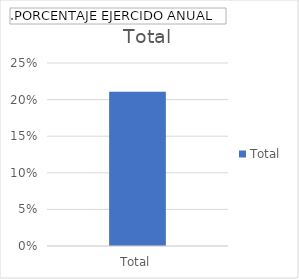
| Category | Total |
|---|---|
| Total | 0.211 |